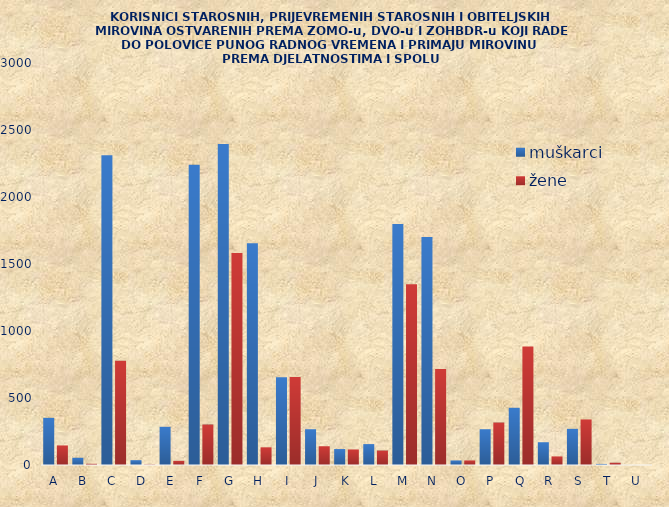
| Category | muškarci | žene |
|---|---|---|
| A | 352 | 146 |
| B | 54 | 9 |
| C | 2311 | 778 |
| D | 36 | 3 |
| E | 285 | 31 |
| F | 2240 | 302 |
| G | 2395 | 1582 |
| H | 1654 | 132 |
| I | 654 | 657 |
| J | 267 | 140 |
| K | 119 | 116 |
| L | 156 | 108 |
| M | 1798 | 1348 |
| N | 1701 | 716 |
| O | 34 | 34 |
| P | 267 | 317 |
| Q | 427 | 885 |
| R | 170 | 64 |
| S | 270 | 340 |
| T | 8 | 17 |
| U | 0 | 0 |